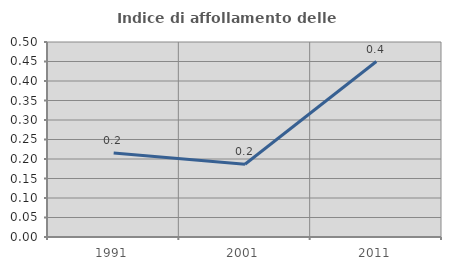
| Category | Indice di affollamento delle abitazioni  |
|---|---|
| 1991.0 | 0.215 |
| 2001.0 | 0.187 |
| 2011.0 | 0.45 |